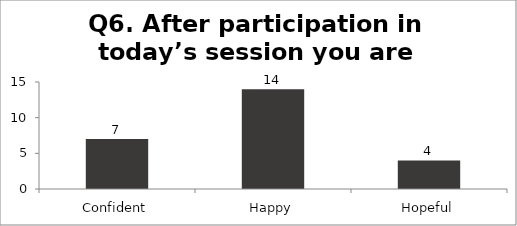
| Category | Q6. After participation in today’s session you are feeling? |
|---|---|
| Confident | 7 |
| Happy | 14 |
| Hopeful | 4 |